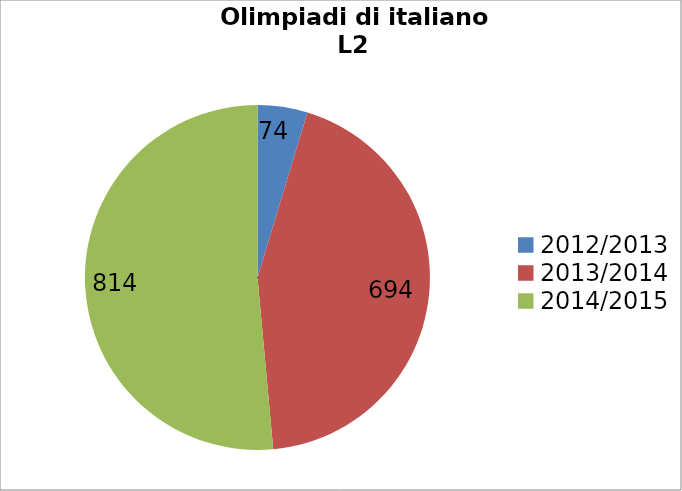
| Category | Alunni |
|---|---|
| 2012/2013 | 74 |
| 2013/2014 | 694 |
| 2014/2015 | 814 |